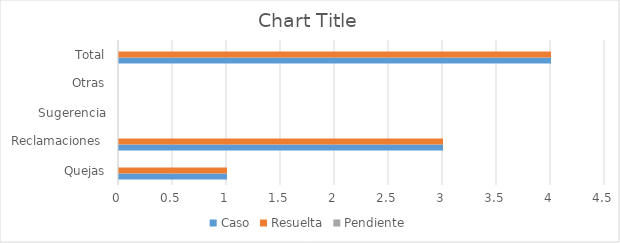
| Category | Caso | Resuelta | Pendiente |
|---|---|---|---|
| Quejas | 1 | 1 | 0 |
| Reclamaciones  | 3 | 3 | 0 |
| Sugerencia | 0 | 0 | 0 |
| Otras | 0 | 0 | 0 |
| Total | 4 | 4 | 0 |